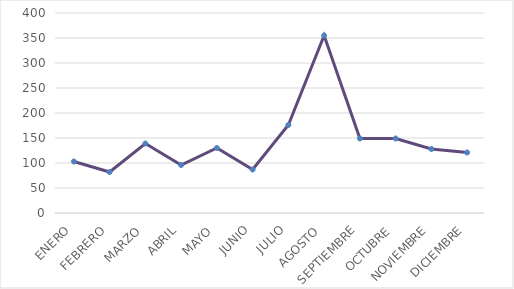
| Category | Series 0 |
|---|---|
| ENERO | 103 |
| FEBRERO | 82 |
| MARZO | 139 |
| ABRIL | 96 |
| MAYO | 130 |
| JUNIO | 87 |
| JULIO | 176 |
| AGOSTO | 355 |
| SEPTIEMBRE | 149 |
| OCTUBRE | 149 |
| NOVIEMBRE | 128 |
| DICIEMBRE | 121 |